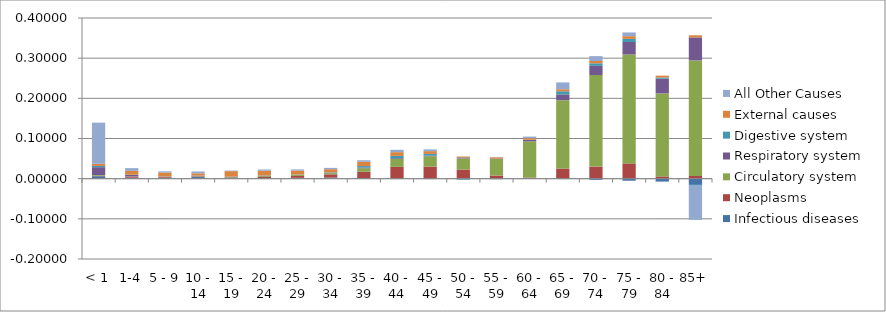
| Category | Infectious diseases  | Neoplasms | Circulatory system | Respiratory system  | Digestive system  | External causes  | All Other Causes |
|---|---|---|---|---|---|---|---|
| < 1 | 0.006 | 0.001 | 0.002 | 0.02 | 0.003 | 0.005 | 0.102 |
| 1-4 | 0.002 | 0.003 | 0.001 | 0.004 | 0.001 | 0.009 | 0.007 |
| 5 - 9 | 0.002 | 0.002 | 0.001 | 0.001 | 0 | 0.009 | 0.003 |
| 10 - 14 | 0.004 | 0.002 | 0.001 | 0.001 | 0 | 0.006 | 0.005 |
| 15 - 19 | 0 | 0.001 | 0.002 | 0.002 | 0 | 0.014 | 0.001 |
| 20 - 24 | 0.001 | 0.003 | 0.002 | 0.001 | 0.001 | 0.012 | 0.003 |
| 25 - 29 | 0.002 | 0.005 | 0.003 | 0.001 | 0 | 0.01 | 0.003 |
| 30 - 34 | 0.003 | 0.008 | 0.003 | 0.001 | 0.001 | 0.008 | 0.003 |
| 35 - 39 | 0.001 | 0.016 | 0.009 | 0.002 | 0.004 | 0.011 | 0.004 |
| 40 - 44 | -0.001 | 0.029 | 0.02 | 0.002 | 0.006 | 0.009 | 0.006 |
| 45 - 49 | -0.001 | 0.03 | 0.026 | 0.002 | 0.004 | 0.007 | 0.004 |
| 50 - 54 | -0.001 | 0.023 | 0.028 | 0.002 | -0.002 | 0.002 | 0 |
| 55 - 59 | -0.001 | 0.007 | 0.041 | 0.001 | 0 | 0.003 | 0.001 |
| 60 - 64 | 0 | 0.003 | 0.09 | 0.004 | 0 | 0.004 | 0.004 |
| 65 - 69 | -0.001 | 0.025 | 0.17 | 0.014 | 0.008 | 0.005 | 0.017 |
| 70 - 74 | -0.003 | 0.03 | 0.228 | 0.023 | 0.006 | 0.006 | 0.012 |
| 75 - 79 | -0.005 | 0.038 | 0.271 | 0.031 | 0.008 | 0.007 | 0.009 |
| 80 - 84 | -0.007 | 0.006 | 0.207 | 0.037 | 0.003 | 0.005 | -0.001 |
| 85+ | -0.015 | 0.007 | 0.287 | 0.057 | -0.002 | 0.005 | -0.085 |